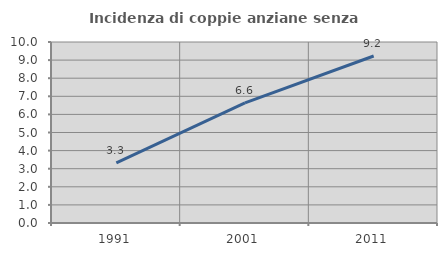
| Category | Incidenza di coppie anziane senza figli  |
|---|---|
| 1991.0 | 3.326 |
| 2001.0 | 6.636 |
| 2011.0 | 9.226 |